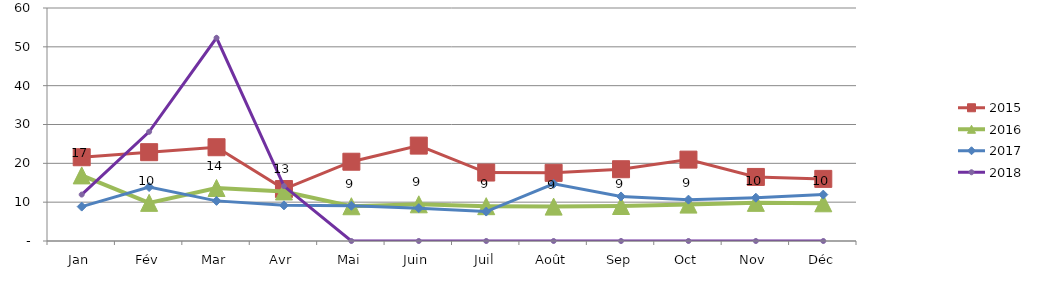
| Category | 2015 | 2016 | 2017 | 2018 |
|---|---|---|---|---|
| Jan | 21.569 | 16.893 | 8.857 | 11.958 |
| Fév | 22.871 | 9.82 | 13.893 | 28.118 |
| Mar | 24.149 | 13.651 | 10.331 | 52.318 |
| Avr | 13.385 | 12.755 | 9.184 | 14.134 |
| Mai | 20.414 | 8.951 | 9.069 | 0 |
| Juin | 24.566 | 9.45 | 8.464 | 0 |
| Juil | 17.631 | 8.967 | 7.577 | 0 |
| Août | 17.55 | 8.853 | 14.73 | 0 |
| Sep | 18.483 | 9.01 | 11.473 | 0 |
| Oct | 20.956 | 9.373 | 10.651 | 0 |
| Nov | 16.494 | 9.821 | 11.149 | 0 |
| Déc | 15.997 | 9.712 | 11.948 | 0 |